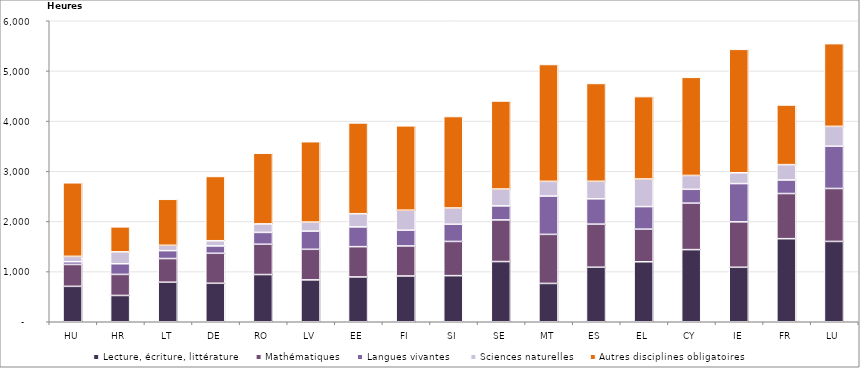
| Category | Lecture, écriture, littérature  | Mathématiques | Langues vivantes  | Sciences naturelles | Autres disciplines obligatoires |
|---|---|---|---|---|---|
| HU | 706 | 436 | 54 | 108 | 1466 |
| HR | 524 | 420 | 212 | 238 | 498 |
| LT | 788 | 472 | 158 | 106 | 917 |
| DE | 767 | 598 | 147 | 103 | 1281 |
| RO | 941 | 604 | 236 | 170 | 1409 |
| LV | 835 | 609 | 362 | 181 | 1602 |
| EE | 893 | 604 | 394 | 263 | 1810 |
| FI | 912 | 599 | 314 | 399 | 1681 |
| SI | 919 | 682 | 343 | 324 | 1823 |
| SE | 1200 | 830 | 280 | 336 | 1754 |
| MT | 764 | 978 | 764 | 293 | 2329 |
| ES | 1087 | 859 | 505 | 349 | 1950 |
| EL | 1196 | 650 | 450 | 550 | 1642 |
| CY | 1438 | 926 | 276 | 276 | 1956 |
| IE | 1086 | 906 | 762 | 216 | 2460 |
| FR | 1656 | 900 | 270 | 306 | 1188 |
| LU | 1601 | 1056 | 842 | 396 | 1649 |